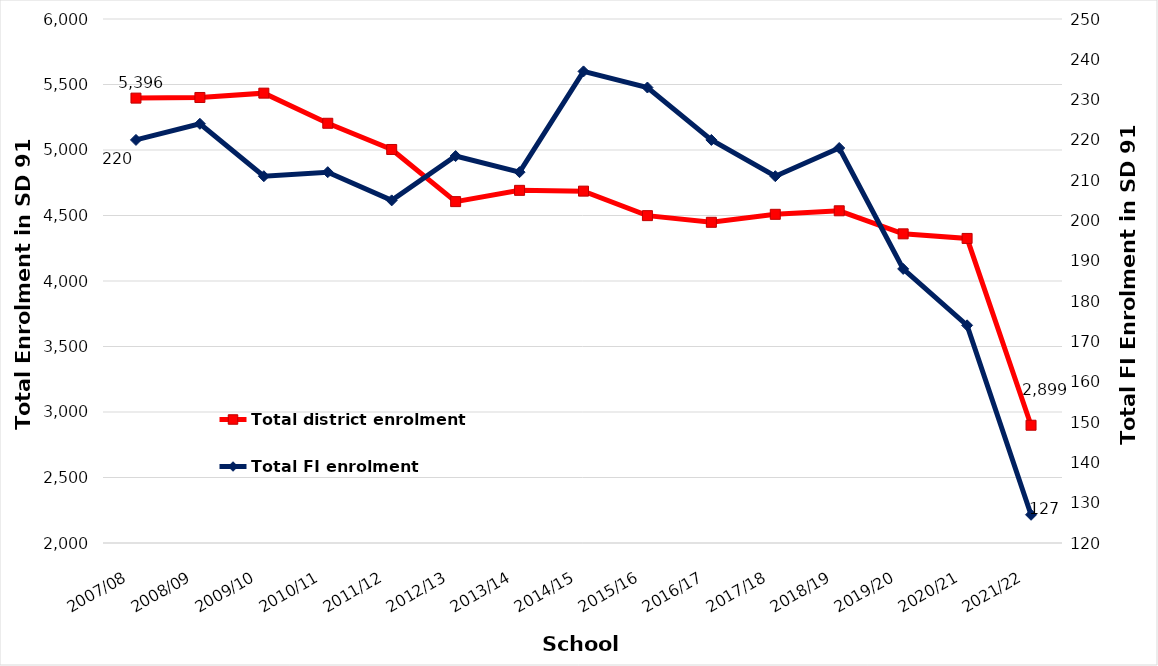
| Category | Total district enrolment  |
|---|---|
| 2007/08 | 5396 |
| 2008/09 | 5401 |
| 2009/10 | 5434 |
| 2010/11 | 5204 |
| 2011/12 | 5004 |
| 2012/13 | 4606 |
| 2013/14 | 4692 |
| 2014/15 | 4686 |
| 2015/16 | 4499 |
| 2016/17 | 4448 |
| 2017/18 | 4509 |
| 2018/19 | 4536 |
| 2019/20 | 4360 |
| 2020/21 | 4325 |
| 2021/22 | 2899 |